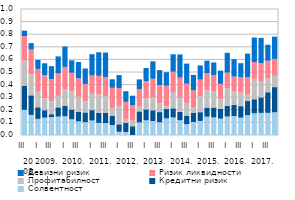
| Category | Солвентност | Кредитни ризик | Профитабилност | Ризик ликвидности | Девизни ризик |
|---|---|---|---|---|---|
| 0 | 0.2 | 0.189 | 0.2 | 0.197 | 0.042 |
| 1 | 0.159 | 0.156 | 0.166 | 0.197 | 0.051 |
| 2 | 0.128 | 0.092 | 0.123 | 0.181 | 0.071 |
| 3 | 0.138 | 0.059 | 0.094 | 0.185 | 0.093 |
| 4 | 0.142 | 0.023 | 0.103 | 0.176 | 0.103 |
| 5 | 0.146 | 0.073 | 0.091 | 0.178 | 0.135 |
| 6 | 0.149 | 0.083 | 0.132 | 0.177 | 0.162 |
| 7 | 0.125 | 0.077 | 0.146 | 0.147 | 0.098 |
| 8 | 0.108 | 0.077 | 0.119 | 0.146 | 0.129 |
| 9 | 0.102 | 0.077 | 0.089 | 0.137 | 0.123 |
| 10 | 0.115 | 0.082 | 0.13 | 0.145 | 0.169 |
| 11 | 0.097 | 0.079 | 0.145 | 0.149 | 0.187 |
| 12 | 0.094 | 0.08 | 0.134 | 0.15 | 0.196 |
| 13 | 0.079 | 0.073 | 0.06 | 0.163 | 0.067 |
| 14 | 0.026 | 0.059 | 0.144 | 0.143 | 0.104 |
| 15 | 0.023 | 0.072 | 0.032 | 0.135 | 0.084 |
| 16 | 0 | 0.069 | 0.046 | 0.121 | 0.076 |
| 17 | 0.101 | 0.087 | 0.038 | 0.137 | 0.079 |
| 18 | 0.117 | 0.086 | 0.088 | 0.137 | 0.103 |
| 19 | 0.111 | 0.085 | 0.104 | 0.146 | 0.138 |
| 20 | 0.102 | 0.08 | 0.07 | 0.144 | 0.119 |
| 21 | 0.132 | 0.074 | 0.022 | 0.164 | 0.107 |
| 22 | 0.139 | 0.072 | 0.124 | 0.167 | 0.138 |
| 23 | 0.117 | 0.066 | 0.113 | 0.159 | 0.184 |
| 24 | 0.086 | 0.068 | 0.101 | 0.153 | 0.159 |
| 25 | 0.103 | 0.074 | 0.039 | 0.138 | 0.122 |
| 26 | 0.112 | 0.069 | 0.127 | 0.132 | 0.112 |
| 27 | 0.145 | 0.072 | 0.138 | 0.135 | 0.1 |
| 28 | 0.14 | 0.079 | 0.13 | 0.126 | 0.101 |
| 29 | 0.13 | 0.078 | 0.075 | 0.123 | 0.105 |
| 30 | 0.147 | 0.086 | 0.141 | 0.122 | 0.157 |
| 31 | 0.151 | 0.089 | 0.107 | 0.117 | 0.138 |
| 32 | 0.138 | 0.091 | 0.107 | 0.123 | 0.111 |
| 33 | 0.158 | 0.112 | 0.051 | 0.137 | 0.188 |
| 34 | 0.172 | 0.111 | 0.162 | 0.132 | 0.195 |
| 35 | 0.175 | 0.123 | 0.125 | 0.147 | 0.2 |
| 36 | 0.176 | 0.164 | 0.112 | 0.138 | 0.127 |
| 37 | 0.18 | 0.2 | 0.089 | 0.135 | 0.176 |